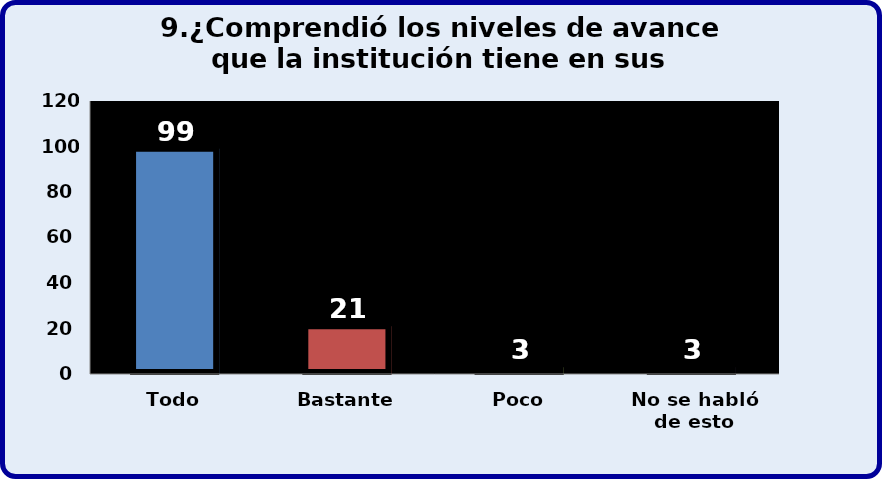
| Category | Series 0 |
|---|---|
| Todo | 99 |
| Bastante | 21 |
| Poco | 3 |
| No se habló de esto | 3 |